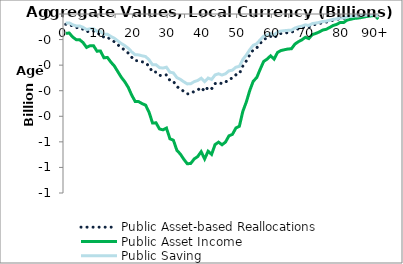
| Category | Public Asset-based Reallocations | Public Asset Income | Public Saving |
|---|---|---|---|
| 0 | -40.298 | -75.55 | -35.252 |
|  | -39.683 | -74.397 | -34.714 |
| 2 | -48.056 | -90.094 | -42.038 |
| 3 | -53.477 | -100.257 | -46.781 |
| 4 | -53.613 | -100.512 | -46.9 |
| 5 | -59.717 | -111.955 | -52.239 |
| 6 | -69.699 | -130.671 | -60.972 |
| 7 | -66.2 | -124.111 | -57.911 |
| 8 | -66.133 | -123.985 | -57.852 |
| 9 | -77.576 | -145.438 | -67.862 |
| 10 | -77.151 | -144.641 | -67.49 |
| 11 | -91.361 | -171.282 | -79.921 |
| 12 | -90.595 | -169.846 | -79.251 |
| 13 | -100.334 | -188.105 | -87.771 |
| 14 | -108.456 | -203.331 | -94.875 |
| 15 | -120.318 | -225.571 | -105.253 |
| 16 | -131.902 | -247.288 | -115.386 |
| 17 | -141.322 | -264.948 | -123.626 |
| 18 | -153.031 | -286.9 | -133.869 |
| 19 | -169.289 | -317.38 | -148.091 |
| 20 | -182.43 | -342.018 | -159.587 |
| 21 | -182.776 | -342.665 | -159.889 |
| 22 | -187.011 | -350.606 | -163.594 |
| 23 | -190.072 | -356.344 | -166.272 |
| 24 | -205.133 | -384.58 | -179.447 |
| 25 | -227.32 | -426.177 | -198.856 |
| 26 | -227.016 | -425.606 | -198.59 |
| 27 | -239.805 | -449.583 | -209.778 |
| 28 | -241.631 | -453.005 | -211.374 |
| 29 | -237.884 | -445.981 | -208.097 |
| 30 | -260.251 | -487.914 | -227.663 |
| 31 | -263.242 | -493.521 | -230.279 |
| 32 | -284.207 | -532.827 | -248.62 |
| 33 | -292.13 | -547.68 | -255.55 |
| 34 | -302.921 | -567.911 | -264.99 |
| 35 | -312.468 | -585.81 | -273.342 |
| 36 | -311.691 | -584.353 | -272.662 |
| 37 | -302.274 | -566.697 | -264.424 |
| 38 | -297.371 | -557.506 | -260.135 |
| 39 | -287.195 | -538.429 | -251.234 |
| 40 | -302.344 | -566.828 | -264.485 |
| 41 | -286.227 | -536.613 | -250.386 |
| 42 | -292.816 | -548.966 | -256.15 |
| 43 | -272.373 | -510.641 | -238.268 |
| 44 | -267.354 | -501.232 | -233.877 |
| 45 | -272.792 | -511.426 | -238.634 |
| 46 | -267.224 | -500.987 | -233.763 |
| 47 | -254.163 | -476.501 | -222.338 |
| 48 | -251.083 | -470.726 | -219.643 |
| 49 | -237.883 | -445.979 | -208.096 |
| 50 | -234.174 | -439.025 | -204.851 |
| 51 | -203.01 | -380.6 | -177.59 |
| 52 | -183.653 | -344.31 | -160.657 |
| 53 | -159.411 | -298.861 | -139.45 |
| 54 | -140.078 | -262.615 | -122.538 |
| 55 | -132.721 | -248.823 | -116.102 |
| 56 | -115.209 | -215.991 | -100.783 |
| 57 | -98.976 | -185.559 | -86.583 |
| 58 | -94.016 | -176.26 | -82.244 |
| 59 | -87.219 | -163.517 | -76.298 |
| 60 | -94.123 | -176.46 | -82.337 |
| 61 | -80.14 | -150.245 | -70.105 |
| 62 | -76.174 | -142.81 | -66.636 |
| 63 | -74.495 | -139.663 | -65.167 |
| 64 | -73.065 | -136.981 | -63.916 |
| 65 | -72.4 | -135.735 | -63.335 |
| 66 | -62.736 | -117.616 | -54.88 |
| 67 | -57.785 | -108.334 | -50.549 |
| 68 | -53.928 | -101.103 | -47.175 |
| 69 | -48.581 | -91.078 | -42.498 |
| 70 | -51.29 | -96.158 | -44.868 |
| 71 | -42.899 | -80.425 | -37.527 |
| 72 | -40.556 | -76.034 | -35.478 |
| 73 | -37.535 | -70.37 | -32.835 |
| 74 | -33.477 | -62.762 | -29.285 |
| 75 | -31.951 | -59.902 | -27.951 |
| 76 | -28.13 | -52.737 | -24.607 |
| 77 | -23.982 | -44.962 | -20.979 |
| 78 | -21.774 | -40.822 | -19.048 |
| 79 | -17.729 | -33.238 | -15.509 |
| 80 | -17.912 | -33.581 | -15.669 |
| 81 | -12.838 | -24.069 | -11.23 |
| 82 | -11.057 | -20.73 | -9.673 |
| 83 | -9.377 | -17.579 | -8.203 |
| 84 | -8.591 | -16.106 | -7.515 |
| 85 | -7.564 | -14.182 | -6.617 |
| 86 | -6.056 | -11.353 | -5.297 |
| 87 | -4.788 | -8.976 | -4.188 |
| 88 | -3.84 | -7.198 | -3.359 |
| 89 | -3.008 | -5.638 | -2.631 |
| 90+ | -10.678 | -20.018 | -9.341 |